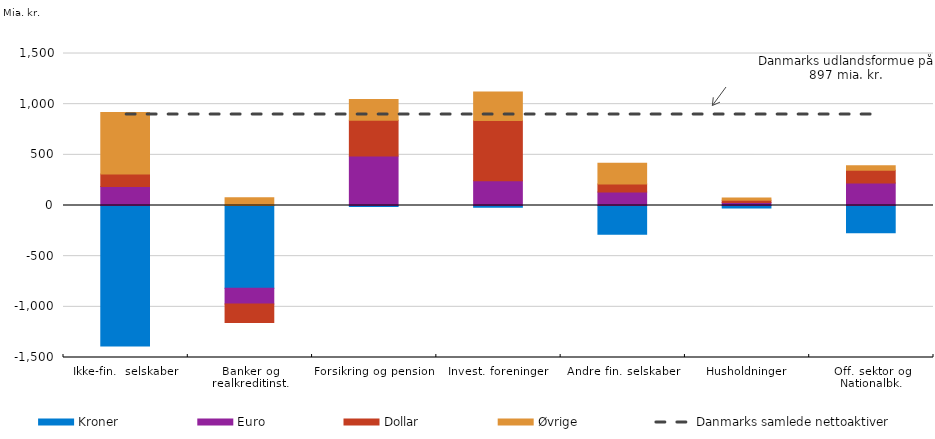
| Category | Kroner | Euro | Dollar | Øvrige |
|---|---|---|---|---|
| Ikke-fin.  selskaber | -1387421 | 188283 | 122177 | 607310 |
| Banker og realkreditinst. | -815782 | -155418 | -184458 | 77396 |
| Forsikring og pension | -9043 | 489141 | 351149 | 206887 |
| Invest. foreninger | -18204 | 245278 | 592915 | 280817 |
| Andre fin. selskaber | -282958 | 132202 | 80128 | 205274 |
| Husholdninger | -25132 | 28654 | 24131 | 20677 |
| Off. sektor og Nationalbk. | -269358 | 222825 | 124428 | 45698 |